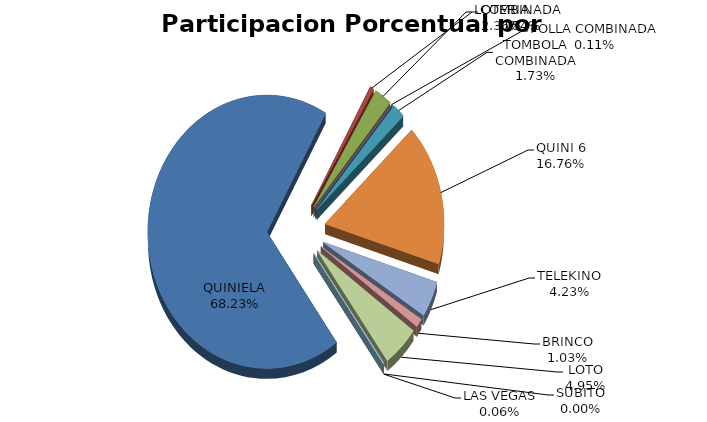
| Category | Series 0 |
|---|---|
| QUINIELA | 21123192.12 |
| COMBINADA | 167727.53 |
| LOTERIA | 731158.28 |
| POLLA COMBINADA | 34963.15 |
| TOMBOLA COMBINADA | 535071 |
| QUINI 6 | 5187656.35 |
| TELEKINO | 1310267.4 |
| BRINCO | 317632.996 |
| LOTO | 1532608.33 |
| SUBITO | 0 |
| LAS VEGAS | 18386.01 |